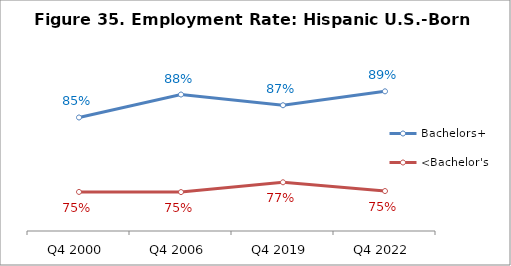
| Category | Bachelors+ | <Bachelor's |
|---|---|---|
| Q4 2000 | 0.853 | 0.753 |
| Q4 2006 | 0.883 | 0.752 |
| Q4 2019 | 0.869 | 0.765 |
| Q4 2022 | 0.888 | 0.754 |